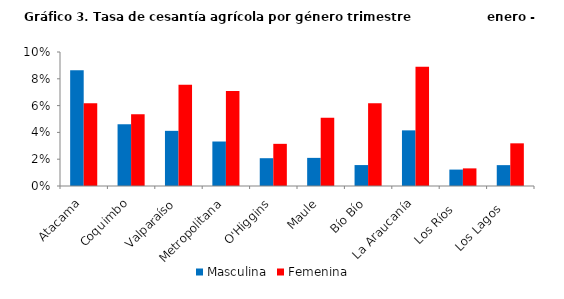
| Category | Masculina | Femenina |
|---|---|---|
| Atacama | 0.086 | 0.062 |
| Coquimbo | 0.046 | 0.054 |
| Valparaíso | 0.041 | 0.076 |
| Metropolitana | 0.033 | 0.071 |
| O'Higgins | 0.021 | 0.031 |
| Maule | 0.021 | 0.051 |
| Bío Bío | 0.016 | 0.062 |
| La Araucanía | 0.042 | 0.089 |
| Los Ríos   | 0.012 | 0.013 |
| Los Lagos   | 0.016 | 0.032 |